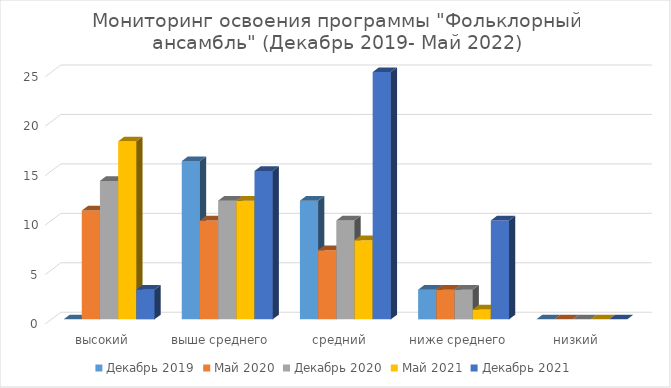
| Category | Декабрь 2019 | Май 2020 | Декабрь 2020 | Май 2021 | Декабрь 2021 |
|---|---|---|---|---|---|
| высокий | 0 | 11 | 14 | 18 | 3 |
| выше среднего | 16 | 10 | 12 | 12 | 15 |
| средний | 12 | 7 | 10 | 8 | 25 |
| ниже среднего | 3 | 3 | 3 | 1 | 10 |
| низкий | 0 | 0 | 0 | 0 | 0 |